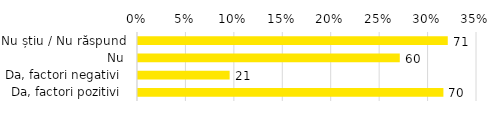
| Category | Series 0 |
|---|---|
| Da, factori pozitivi  | 0.315 |
| Da, factori negativi  | 0.095 |
| Nu | 0.27 |
| Nu știu / Nu răspund | 0.32 |